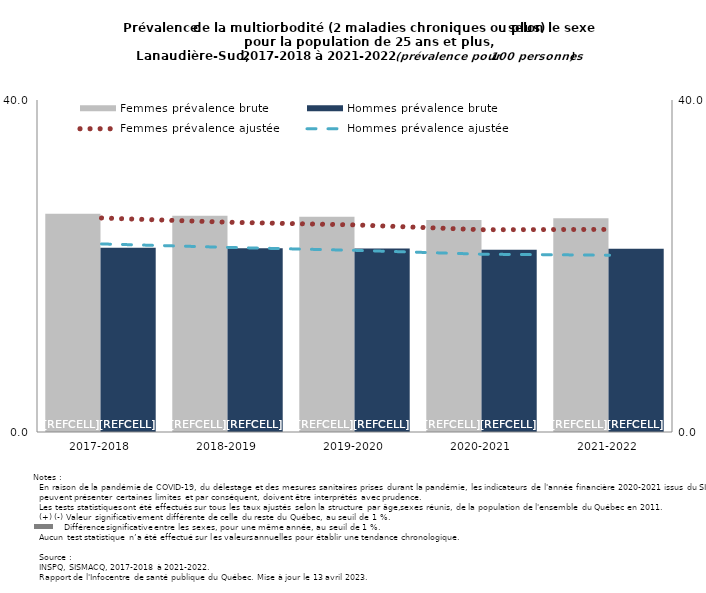
| Category | Femmes prévalence brute | Hommes prévalence brute |
|---|---|---|
| 2017-2018 | 26.299 | 22.19 |
| 2018-2019 | 26.058 | 22.124 |
| 2019-2020 | 25.94 | 22.102 |
| 2020-2021 | 25.548 | 21.949 |
| 2021-2022 | 25.759 | 22.074 |